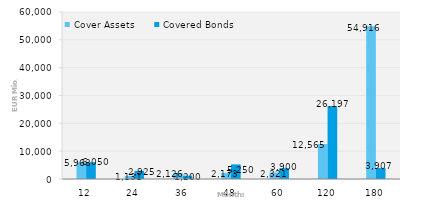
| Category | Cover Assets | Covered Bonds |
|---|---|---|
| 12.0 | 5963.12 | 6050 |
| 24.0 | 1131.46 | 2925 |
| 36.0 | 2125.99 | 1200 |
| 48.0 | 2173.1 | 5250 |
| 60.0 | 2321.07 | 3900 |
| 120.0 | 12564.81 | 26197.2 |
| 180.0 | 54915.86 | 3907 |